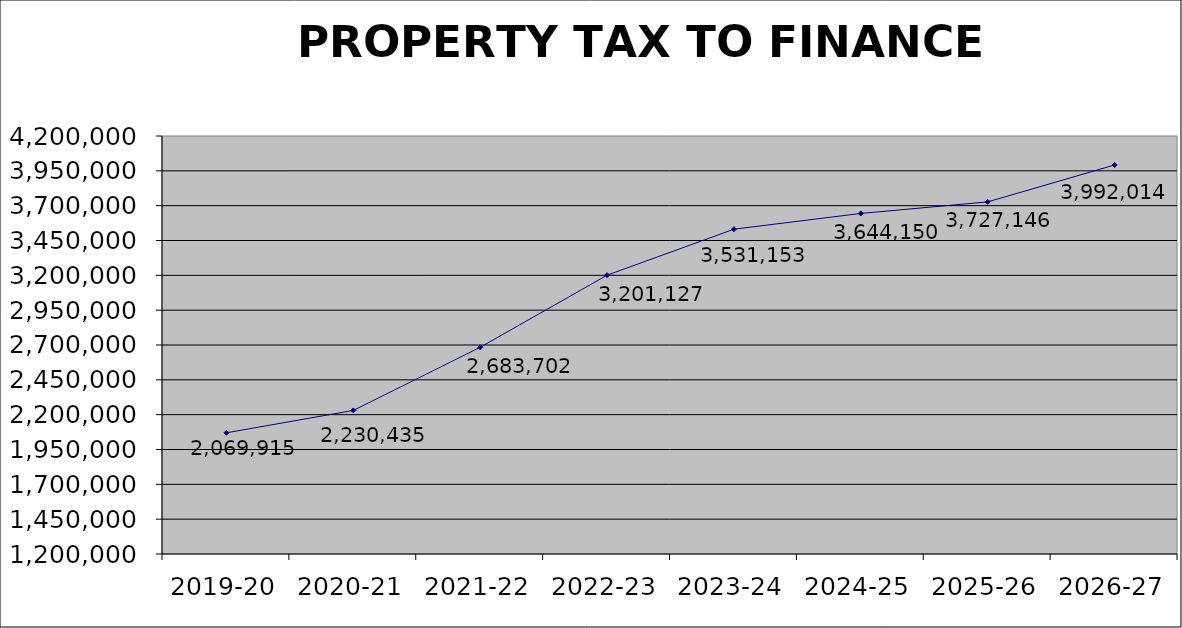
| Category | Series 0 |
|---|---|
| 2019-20 | 2069915 |
| 2020-21 | 2230435 |
| 2021-22 | 2683702 |
| 2022-23 | 3201127 |
| 2023-24 | 3531153 |
| 2024-25 | 3644150 |
| 2025-26 | 3727146 |
| 2026-27 | 3992014 |